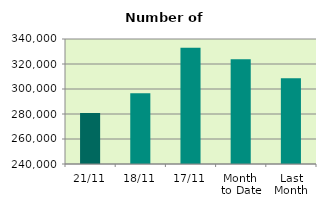
| Category | Series 0 |
|---|---|
| 21/11 | 280806 |
| 18/11 | 296660 |
| 17/11 | 332924 |
| Month 
to Date | 323706.8 |
| Last
Month | 308508.19 |